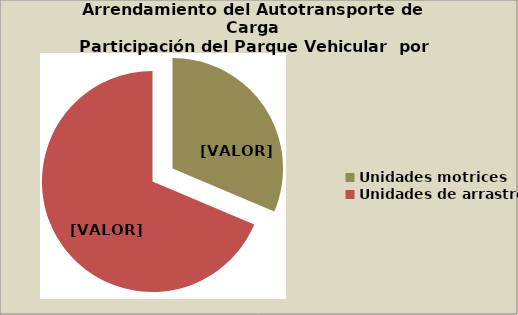
| Category | Series 0 |
|---|---|
| Unidades motrices | 31.377 |
| Unidades de arrastre | 68.623 |